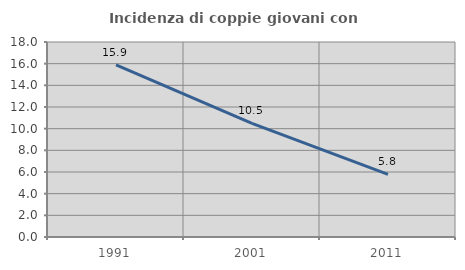
| Category | Incidenza di coppie giovani con figli |
|---|---|
| 1991.0 | 15.888 |
| 2001.0 | 10.494 |
| 2011.0 | 5.774 |